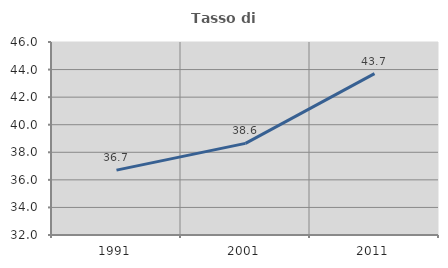
| Category | Tasso di occupazione   |
|---|---|
| 1991.0 | 36.704 |
| 2001.0 | 38.647 |
| 2011.0 | 43.709 |